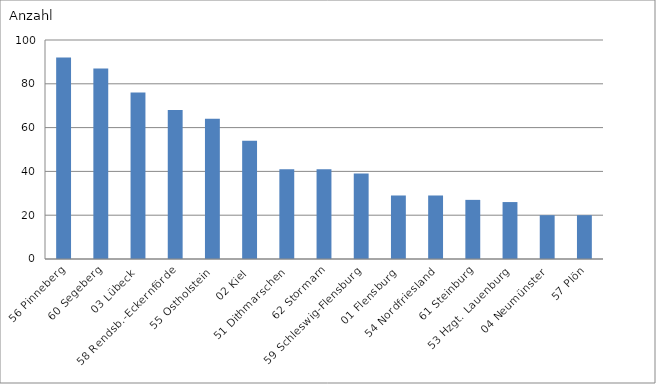
| Category | 56 Pinneberg |
|---|---|
| 56 Pinneberg | 92 |
| 60 Segeberg | 87 |
| 03 Lübeck | 76 |
| 58 Rendsb.-Eckernförde | 68 |
| 55 Ostholstein | 64 |
| 02 Kiel | 54 |
| 51 Dithmarschen | 41 |
| 62 Stormarn | 41 |
| 59 Schleswig-Flensburg | 39 |
| 01 Flensburg | 29 |
| 54 Nordfriesland | 29 |
| 61 Steinburg | 27 |
| 53 Hzgt. Lauenburg | 26 |
| 04 Neumünster | 20 |
| 57 Plön | 20 |